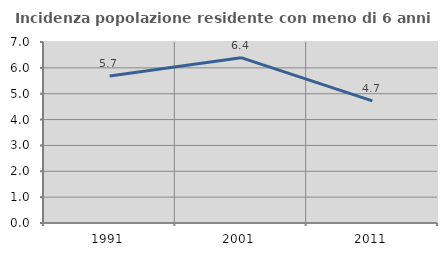
| Category | Incidenza popolazione residente con meno di 6 anni |
|---|---|
| 1991.0 | 5.683 |
| 2001.0 | 6.393 |
| 2011.0 | 4.722 |